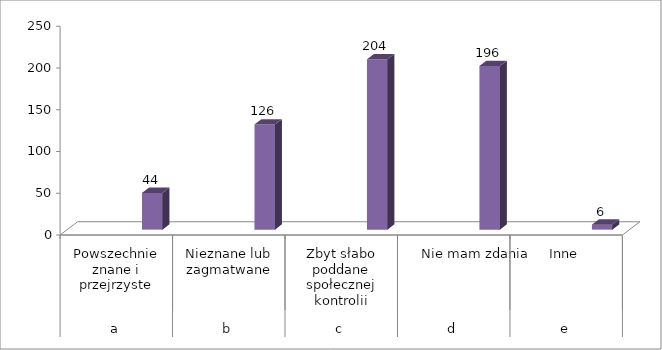
| Category | Series 0 | Series 1 | Series 2 | Series 3 |
|---|---|---|---|---|
| 0 |  |  |  | 44 |
| 1 |  |  |  | 126 |
| 2 |  |  |  | 204 |
| 3 |  |  |  | 196 |
| 4 |  |  |  | 6 |